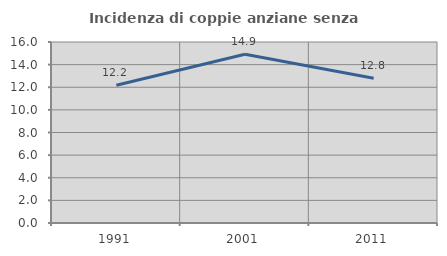
| Category | Incidenza di coppie anziane senza figli  |
|---|---|
| 1991.0 | 12.184 |
| 2001.0 | 14.914 |
| 2011.0 | 12.791 |